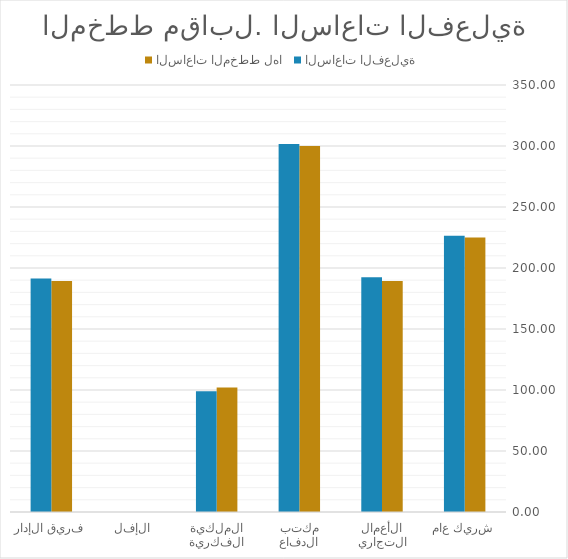
| Category | الساعات المخطط لها | الساعات الفعلية |
|---|---|---|
| شريك عام | 225 | 226.5 |
| الأعمال التجارية | 189.286 | 192.5 |
| مكتب الدفاع | 300 | 301.714 |
| الملكية الفكرية | 102.143 | 99 |
| الإفلاس | 0 | 0 |
| فريق الإدارة | 189.286 | 191.429 |